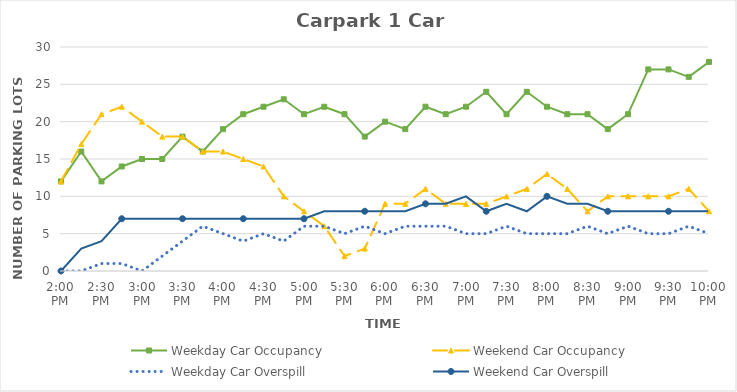
| Category | Weekday Car Occupancy | Weekend Car Occupancy | Weekday Car Overspill | Weekend Car Overspill |
|---|---|---|---|---|
| 0.5833333333333334 | 12 | 12 | 0 | 0 |
| 0.59375 | 16 | 17 | 0 | 3 |
| 0.604166666666667 | 12 | 21 | 1 | 4 |
| 0.614583333333334 | 14 | 22 | 1 | 7 |
| 0.625 | 15 | 20 | 0 | 7 |
| 0.635416666666667 | 15 | 18 | 2 | 7 |
| 0.645833333333334 | 18 | 18 | 4 | 7 |
| 0.656250000000001 | 16 | 16 | 6 | 7 |
| 0.666666666666667 | 19 | 16 | 5 | 7 |
| 0.677083333333334 | 21 | 15 | 4 | 7 |
| 0.687500000000001 | 22 | 14 | 5 | 7 |
| 0.697916666666668 | 23 | 10 | 4 | 7 |
| 0.708333333333335 | 21 | 8 | 6 | 7 |
| 0.718750000000002 | 22 | 6 | 6 | 8 |
| 0.729166666666669 | 21 | 2 | 5 | 8 |
| 0.739583333333336 | 18 | 3 | 6 | 8 |
| 0.75 | 20 | 9 | 5 | 8 |
| 0.7604166666666666 | 19 | 9 | 6 | 8 |
| 0.7708333333333334 | 22 | 11 | 6 | 9 |
| 0.78125 | 21 | 9 | 6 | 9 |
| 0.7916666666666666 | 22 | 9 | 5 | 10 |
| 0.8020833333333334 | 24 | 9 | 5 | 8 |
| 0.8125 | 21 | 10 | 6 | 9 |
| 0.8229166666666666 | 24 | 11 | 5 | 8 |
| 0.8333333333333334 | 22 | 13 | 5 | 10 |
| 0.84375 | 21 | 11 | 5 | 9 |
| 0.8541666666666666 | 21 | 8 | 6 | 9 |
| 0.8645833333333334 | 19 | 10 | 5 | 8 |
| 0.875 | 21 | 10 | 6 | 8 |
| 0.8854166666666666 | 27 | 10 | 5 | 8 |
| 0.8958333333333334 | 27 | 10 | 5 | 8 |
| 0.90625 | 26 | 11 | 6 | 8 |
| 0.9166666666666666 | 28 | 8 | 5 | 8 |